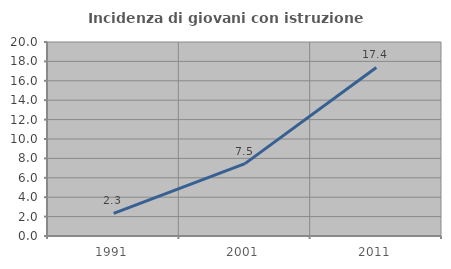
| Category | Incidenza di giovani con istruzione universitaria |
|---|---|
| 1991.0 | 2.326 |
| 2001.0 | 7.46 |
| 2011.0 | 17.372 |